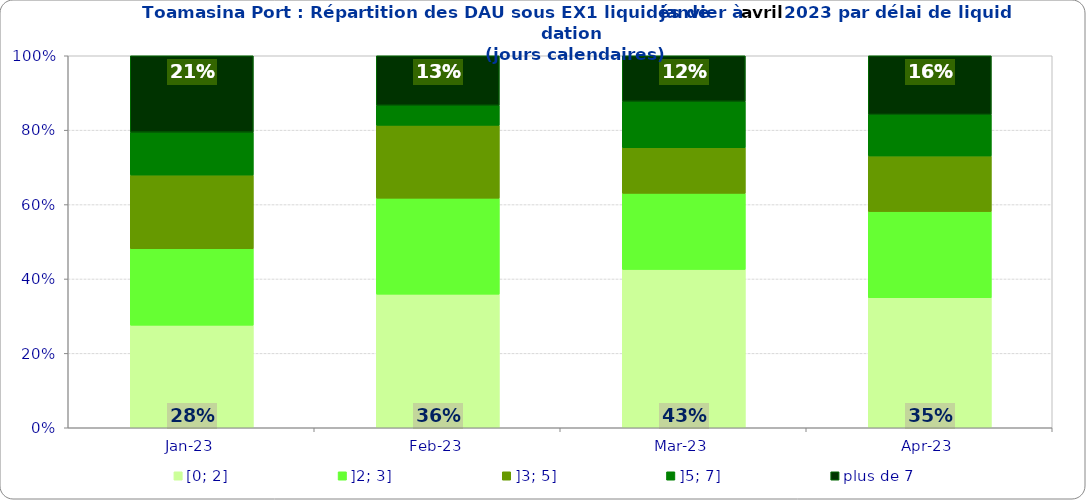
| Category | [0; 2] | ]2; 3] | ]3; 5] | ]5; 7] | plus de 7 |
|---|---|---|---|---|---|
| 2023-01-01 | 0.276 | 0.206 | 0.198 | 0.115 | 0.206 |
| 2023-02-01 | 0.359 | 0.258 | 0.196 | 0.054 | 0.133 |
| 2023-03-01 | 0.426 | 0.204 | 0.123 | 0.125 | 0.123 |
| 2023-04-01 | 0.349 | 0.232 | 0.149 | 0.112 | 0.158 |